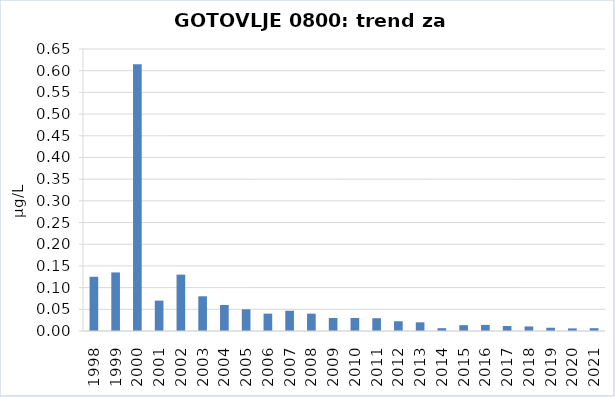
| Category | Vsota |
|---|---|
| 1998 | 0.125 |
| 1999 | 0.135 |
| 2000 | 0.615 |
| 2001 | 0.07 |
| 2002 | 0.13 |
| 2003 | 0.08 |
| 2004 | 0.06 |
| 2005 | 0.05 |
| 2006 | 0.04 |
| 2007 | 0.047 |
| 2008 | 0.04 |
| 2009 | 0.03 |
| 2010 | 0.03 |
| 2011 | 0.03 |
| 2012 | 0.022 |
| 2013 | 0.02 |
| 2014 | 0.006 |
| 2015 | 0.014 |
| 2016 | 0.014 |
| 2017 | 0.012 |
| 2018 | 0.01 |
| 2019 | 0.008 |
| 2020 | 0.006 |
| 2021 | 0.007 |